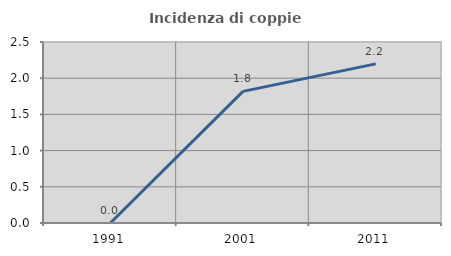
| Category | Incidenza di coppie miste |
|---|---|
| 1991.0 | 0 |
| 2001.0 | 1.818 |
| 2011.0 | 2.198 |